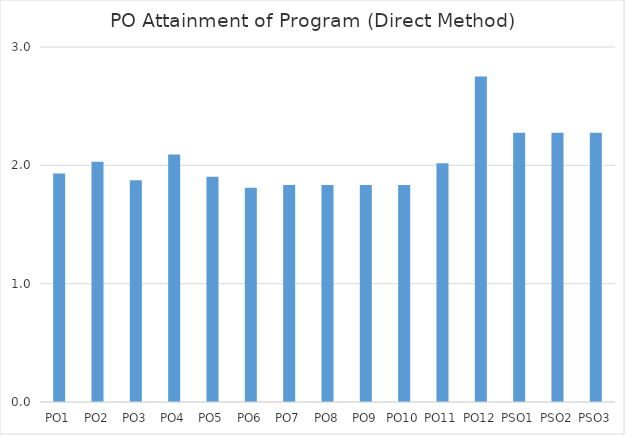
| Category | Series 0 |
|---|---|
| PO1 | 1.931 |
| PO2 | 2.031 |
| PO3 | 1.875 |
| PO4 | 2.092 |
| PO5 | 1.904 |
| PO6 | 1.811 |
| PO7 | 1.833 |
| PO8 | 1.833 |
| PO9 | 1.833 |
| PO10 | 1.833 |
| PO11 | 2.017 |
| PO12 | 2.75 |
| PSO1 | 2.275 |
| PSO2 | 2.275 |
| PSO3 | 2.275 |